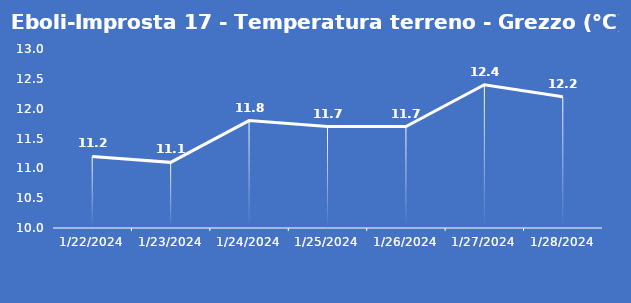
| Category | Eboli-Improsta 17 - Temperatura terreno - Grezzo (°C) |
|---|---|
| 1/22/24 | 11.2 |
| 1/23/24 | 11.1 |
| 1/24/24 | 11.8 |
| 1/25/24 | 11.7 |
| 1/26/24 | 11.7 |
| 1/27/24 | 12.4 |
| 1/28/24 | 12.2 |